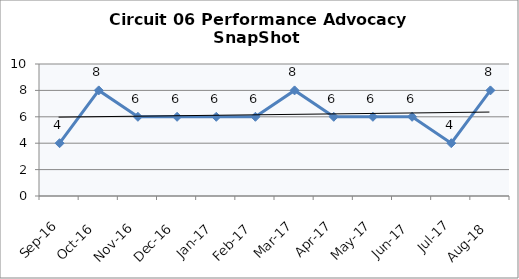
| Category | Circuit 06 |
|---|---|
| Sep-16 | 4 |
| Oct-16 | 8 |
| Nov-16 | 6 |
| Dec-16 | 6 |
| Jan-17 | 6 |
| Feb-17 | 6 |
| Mar-17 | 8 |
| Apr-17 | 6 |
| May-17 | 6 |
| Jun-17 | 6 |
| Jul-17 | 4 |
| Aug-18 | 8 |